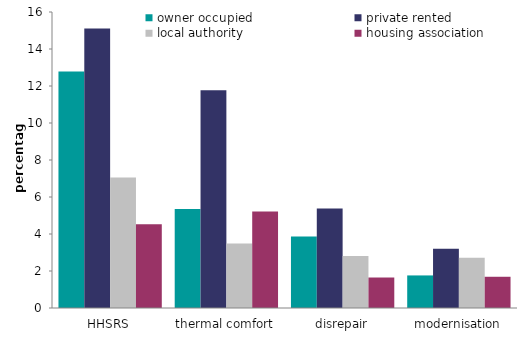
| Category | owner occupied | private rented | local authority | housing association |
|---|---|---|---|---|
| HHSRS | 12.778 | 15.109 | 7.058 | 4.524 |
| thermal comfort | 5.347 | 11.765 | 3.482 | 5.22 |
| disrepair | 3.86 | 5.372 | 2.809 | 1.648 |
| modernisation | 1.761 | 3.201 | 2.715 | 1.688 |